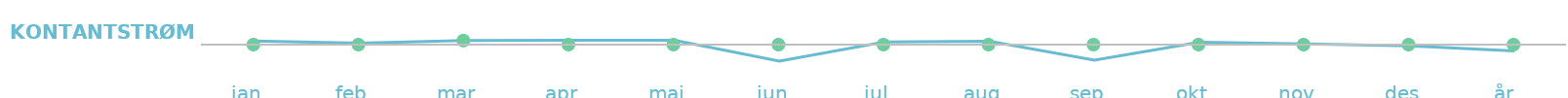
| Category | Kontantstrøm |
|---|---|
| jan  | 169 |
| feb  | 69 |
| mar  | 192 |
| apr  | 199 |
| mai  | 204 |
| jun  | -771 |
| jul  | 124 |
| aug  | 154 |
| sep  | -721 |
| okt  | 109 |
| nov  | 34 |
| des  | -61 |
| år   | -299 |